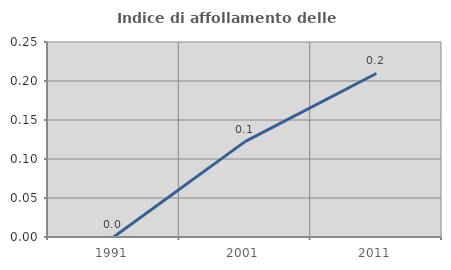
| Category | Indice di affollamento delle abitazioni  |
|---|---|
| 1991.0 | 0 |
| 2001.0 | 0.122 |
| 2011.0 | 0.21 |